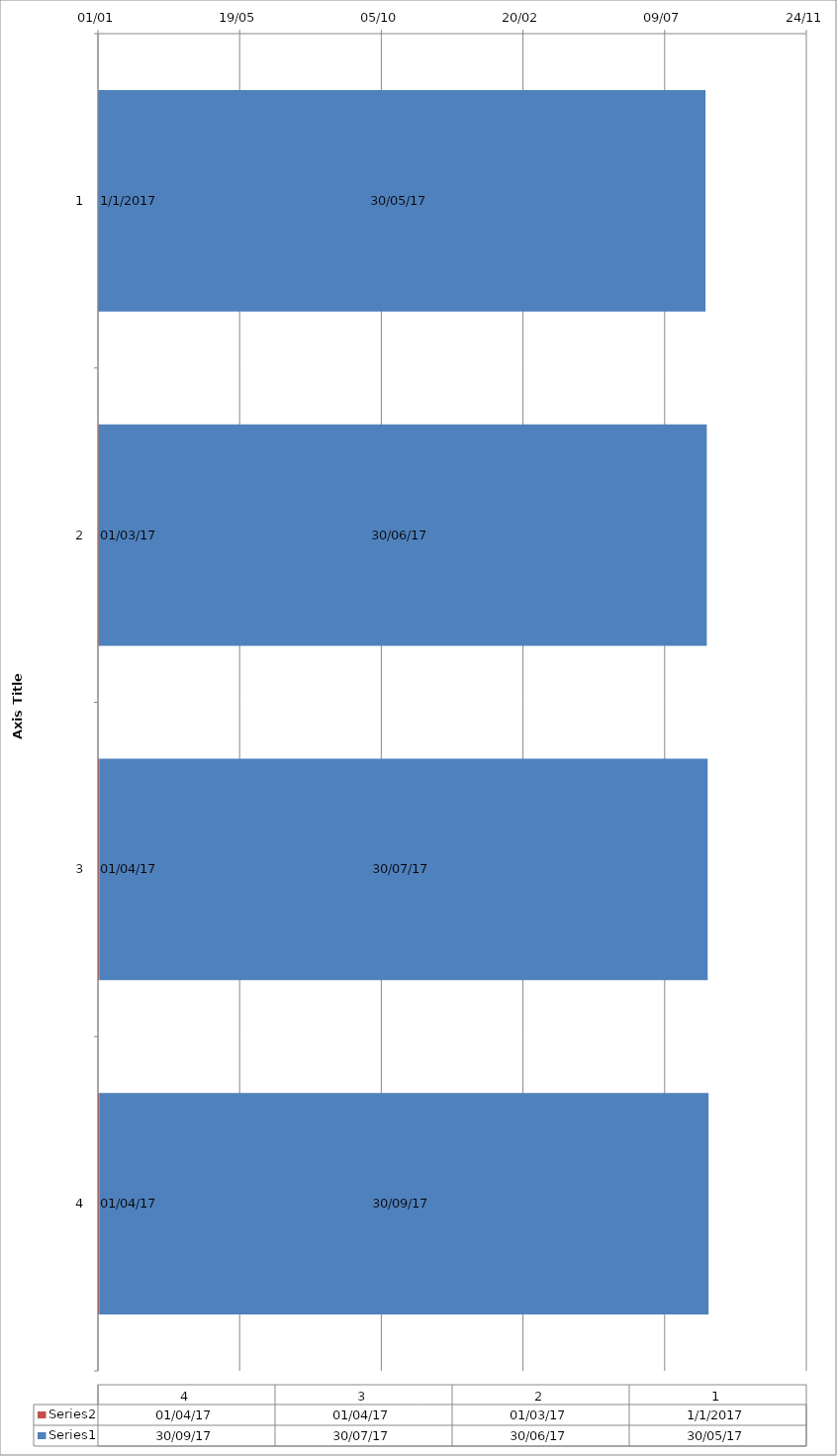
| Category | Series 1 | Series 0 |
|---|---|---|
| 0 | 2017-01-01 | 2017-05-30 |
| 1 | 2017-03-01 | 2017-06-30 |
| 2 | 2017-04-01 | 2017-07-30 |
| 3 | 2017-04-01 | 2017-09-30 |